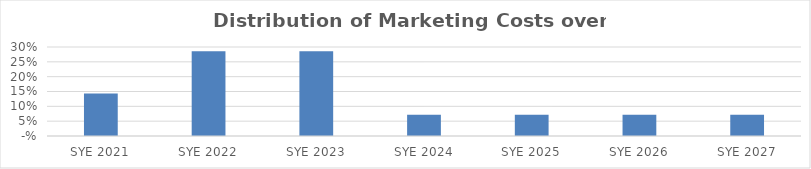
| Category | Series 0 |
|---|---|
| 2021.0 | 0.143 |
| 2022.0 | 0.286 |
| 2023.0 | 0.286 |
| 2024.0 | 0.071 |
| 2025.0 | 0.071 |
| 2026.0 | 0.071 |
| 2027.0 | 0.071 |